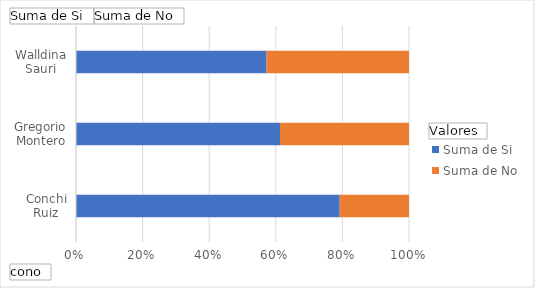
| Category | Suma de Si | Suma de No |
|---|---|---|
| Conchi Ruiz | 0.792 | 0.208 |
| Gregorio Montero | 0.613 | 0.387 |
| Walldina Sauri | 0.572 | 0.428 |